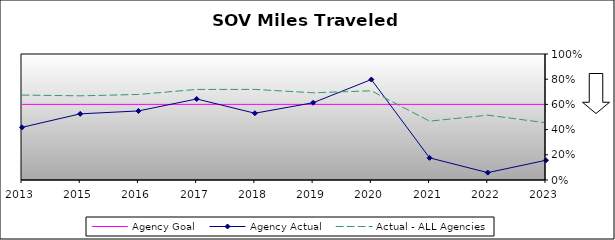
| Category | Agency Goal | Agency Actual | Actual - ALL Agencies |
|---|---|---|---|
| 2013.0 | 0.6 | 0.418 | 0.674 |
| 2015.0 | 0.6 | 0.525 | 0.668 |
| 2016.0 | 0.6 | 0.548 | 0.679 |
| 2017.0 | 0.6 | 0.643 | 0.719 |
| 2018.0 | 0.6 | 0.53 | 0.719 |
| 2019.0 | 0.6 | 0.613 | 0.692 |
| 2020.0 | 0.6 | 0.798 | 0.708 |
| 2021.0 | 0.6 | 0.176 | 0.467 |
| 2022.0 | 0.6 | 0.058 | 0.515 |
| 2023.0 | 0.6 | 0.157 | 0.454 |